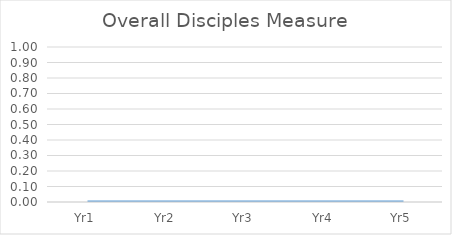
| Category | Series 0 |
|---|---|
| Yr1 | 0 |
| Yr2 | 0 |
| Yr3 | 0 |
| Yr4 | 0 |
| Yr5 | 0 |